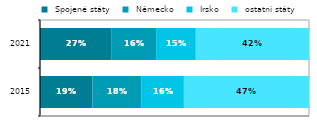
| Category |  Spojené státy |  Německo |  Irsko |  ostatní státy |
|---|---|---|---|---|
|  2015 | 0.195 | 0.183 | 0.158 | 0.465 |
| 2021 | 0.267 | 0.165 | 0.148 | 0.421 |